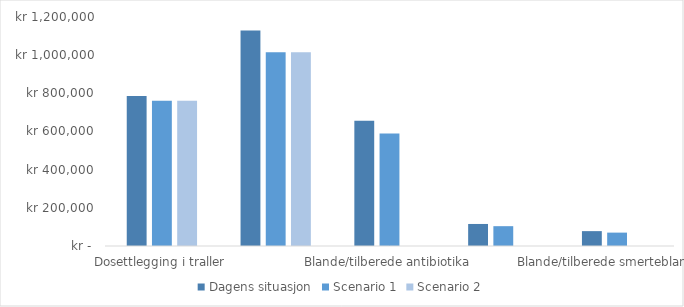
| Category | Dagens situasjon | Scenario 1 | Scenario 2 |
|---|---|---|---|
| Dosettlegging i traller | 786674.33 | 761709.375 | 761709.375 |
| Endring av traller og dobbeltkontroll | 1128880.843 | 1015612.5 | 1015612.5 |
| Blande/tilberede antibiotika | 655909.667 | 590097.76 | 0 |
| Blande/tilberede TPN | 115465.438 | 103880 | 0 |
| Blande/tilberede smerteblanding | 77939.171 | 70119 | 0 |